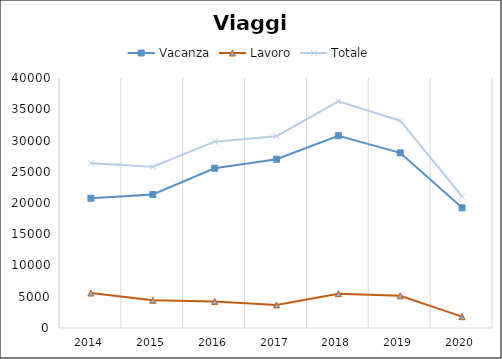
| Category | Vacanza | Lavoro | Totale |
|---|---|---|---|
| 2014.0 | 20760 | 5592 | 26352 |
| 2015.0 | 21366 | 4437 | 25803 |
| 2016.0 | 25561 | 4258 | 29819 |
| 2017.0 | 27002 | 3692 | 30694 |
| 2018.0 | 30768 | 5495 | 36263 |
| 2019.0 | 28022 | 5149 | 33171 |
| 2020.0 | 19231 | 1812 | 21043 |